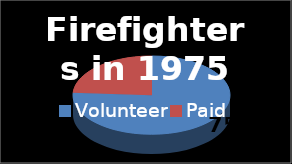
| Category | Series 0 |
|---|---|
| Volunteer | 0.76 |
| Paid | 0.24 |